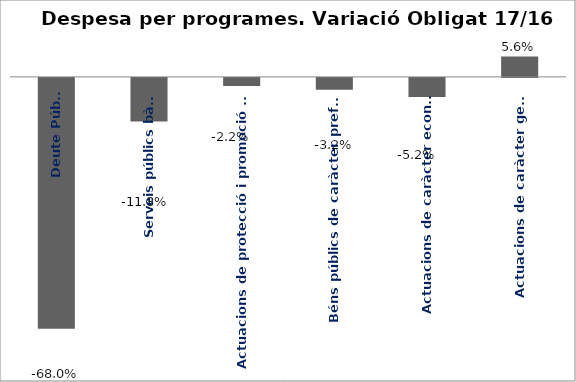
| Category | Series 0 |
|---|---|
| Deute Públic | -0.68 |
| Serveis públics bàsics | -0.118 |
| Actuacions de protecció i promoció social | -0.022 |
| Béns públics de caràcter preferent | -0.032 |
| Actuacions de caràcter econòmic | -0.052 |
| Actuacions de caràcter general | 0.056 |